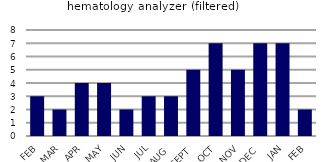
| Category | hematology analyzer (filtered) |
|---|---|
| FEB | 3 |
| MAR | 2 |
| APR | 4 |
| MAY | 4 |
| JUN | 2 |
| JUL | 3 |
| AUG | 3 |
| SEPT | 5 |
| OCT | 7 |
| NOV | 5 |
| DEC | 7 |
| JAN | 7 |
| FEB | 2 |